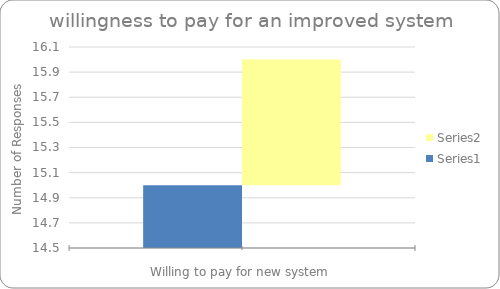
| Category | Series 0 | Series 1 |
|---|---|---|
|  | 15 | 1 |